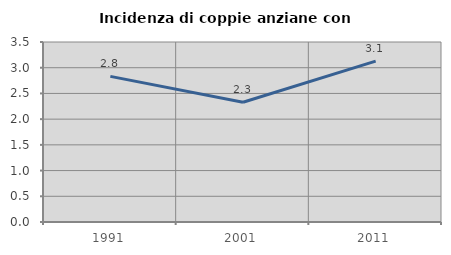
| Category | Incidenza di coppie anziane con figli |
|---|---|
| 1991.0 | 2.832 |
| 2001.0 | 2.329 |
| 2011.0 | 3.129 |